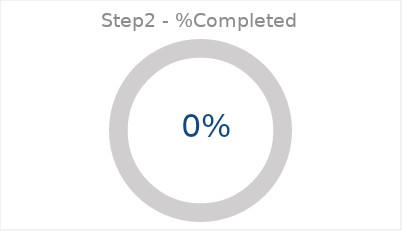
| Category | Series 0 |
|---|---|
| %Completed | 0 |
| %Pending  | 1 |